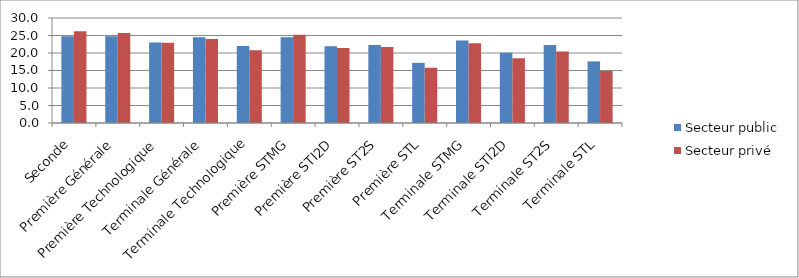
| Category | Secteur public | Secteur privé |
|---|---|---|
| Seconde | 24.8 | 26.2 |
| Première Générale | 24.8 | 25.7 |
| Première Technologique | 23 | 22.9 |
| Terminale Générale | 24.5 | 24 |
| Terminale Technologique | 22 | 20.8 |
| Première STMG | 24.5 | 25.2 |
| Première STI2D | 21.9 | 21.4 |
| Première ST2S | 22.3 | 21.7 |
| Première STL | 17.2 | 15.8 |
| Terminale STMG | 23.6 | 22.8 |
| Terminale STI2D | 20.1 | 18.5 |
| Terminale ST2S | 22.3 | 20.4 |
| Terminale STL | 17.6 | 14.9 |